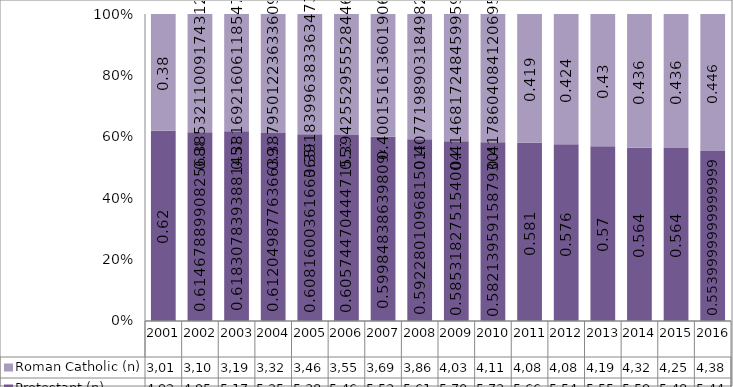
| Category | Protestant (n) | Roman Catholic (n) |
|---|---|---|
| 2001.0 | 4920 | 3017 |
| 2002.0 | 4958 | 3108 |
| 2003.0 | 5174 | 3194 |
| 2004.0 | 5252 | 3329 |
| 2005.0 | 5381 | 3467 |
| 2006.0 | 5462 | 3555 |
| 2007.0 | 5539 | 3695 |
| 2008.0 | 5616 | 3866 |
| 2009.0 | 5701 | 4039 |
| 2010.0 | 5730 | 4113 |
| 2011.0 | 5660 | 4083 |
| 2012.0 | 5547 | 4089 |
| 2013.0 | 5550 | 4195 |
| 2014.0 | 5593 | 4322 |
| 2015.0 | 5489 | 4250 |
| 2016.0 | 5444 | 4388 |